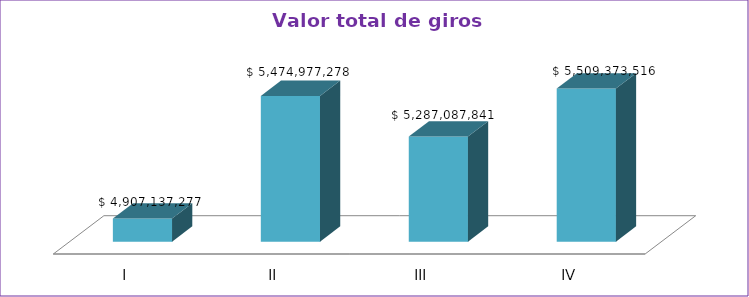
| Category | Series 0 |
|---|---|
| I | 4907137277 |
| II | 5474977278 |
| III | 5287087841 |
| IV | 5509373516 |